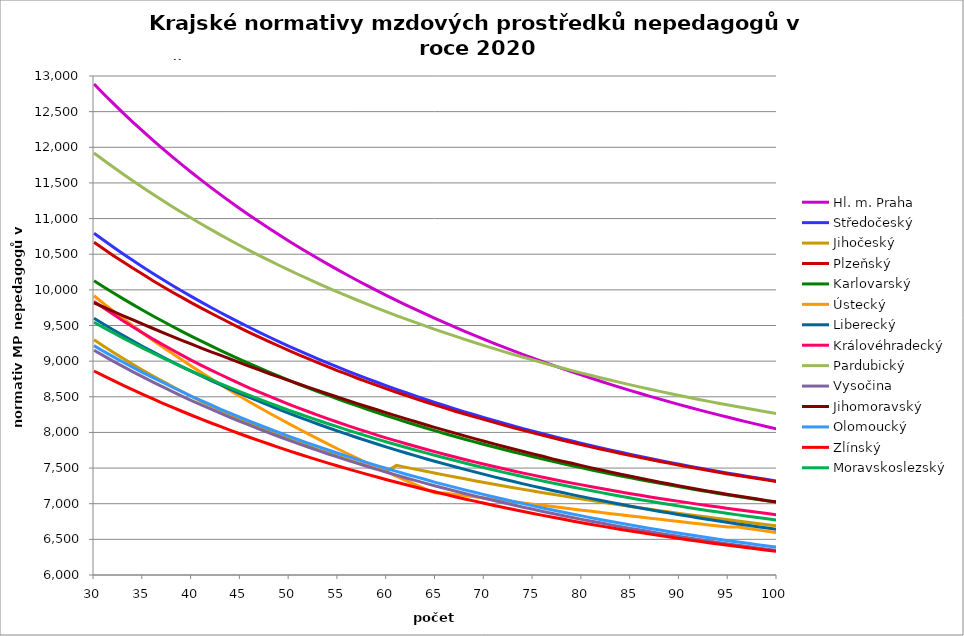
| Category | Hl. m. Praha | Středočeský | Jihočeský | Plzeňský | Karlovarský  | Ústecký   | Liberecký | Královéhradecký | Pardubický | Vysočina | Jihomoravský | Olomoucký | Zlínský | Moravskoslezský |
|---|---|---|---|---|---|---|---|---|---|---|---|---|---|---|
| 30.0 | 12887.899 | 10794.617 | 9300.023 | 10666.408 | 10127.339 | 9916.766 | 9600.68 | 9838.432 | 11920.836 | 9151.884 | 9818.262 | 9217.837 | 8861.837 | 9545.303 |
| 31.0 | 12747.959 | 10695.102 | 9209.316 | 10572.088 | 10040.577 | 9807.918 | 9517.817 | 9744.804 | 11818.709 | 9073.621 | 9756.943 | 9136.354 | 8793.187 | 9469.297 |
| 32.0 | 12611.88 | 10598.164 | 9121.343 | 10479.421 | 9955.947 | 9701.435 | 9437 | 9652.941 | 11719.092 | 8996.979 | 9696.386 | 9059.606 | 8726.113 | 9395.074 |
| 33.0 | 12479.512 | 10503.714 | 9036 | 10392.29 | 9873.379 | 9597.238 | 9358.161 | 9562.794 | 11621.902 | 8922.195 | 9636.575 | 8984.136 | 8660.569 | 9322.577 |
| 34.0 | 12350.715 | 10411.665 | 8953.186 | 10302.735 | 9792.806 | 9495.256 | 9281.237 | 9477.823 | 11527.059 | 8849.492 | 9577.497 | 8913.115 | 8596.508 | 9251.755 |
| 35.0 | 12225.352 | 10321.936 | 8872.806 | 10218.506 | 9714.163 | 9395.419 | 9206.165 | 9394.349 | 11434.489 | 8778.521 | 9519.14 | 8840.057 | 8533.888 | 9182.557 |
| 36.0 | 12103.296 | 10234.448 | 8794.77 | 10131.909 | 9637.39 | 9297.659 | 9132.885 | 9312.332 | 11344.12 | 8709.227 | 9461.489 | 8771.287 | 8472.665 | 9114.933 |
| 37.0 | 11984.426 | 10149.128 | 8718.993 | 10050.439 | 9562.427 | 9201.912 | 9061.343 | 9235.065 | 11255.882 | 8641.288 | 9404.533 | 8703.579 | 8412.799 | 9048.837 |
| 38.0 | 11868.625 | 10065.903 | 8645.394 | 9970.268 | 9489.22 | 9111.435 | 8991.482 | 9159.07 | 11169.71 | 8575.197 | 9348.258 | 8636.908 | 8354.252 | 8984.225 |
| 39.0 | 11755.783 | 9984.705 | 8573.895 | 9894.926 | 9417.713 | 9019.466 | 8923.253 | 9084.315 | 11085.54 | 8510.372 | 9292.652 | 8571.251 | 8296.985 | 8921.054 |
| 40.0 | 11645.796 | 9905.471 | 8504.423 | 9817.208 | 9347.856 | 8929.336 | 8856.604 | 9010.771 | 11003.311 | 8447.291 | 9237.704 | 8506.584 | 8240.964 | 8859.282 |
| 41.0 | 11538.564 | 9828.137 | 8436.909 | 9744.153 | 9279.599 | 8840.989 | 8791.489 | 8941.53 | 10922.967 | 8385.901 | 9183.402 | 8445.761 | 8186.153 | 8798.869 |
| 42.0 | 11433.991 | 9752.644 | 8371.286 | 9672.177 | 9212.895 | 8754.374 | 8727.861 | 8873.345 | 10844.45 | 8325.397 | 9129.735 | 8385.801 | 8132.52 | 8739.778 |
| 43.0 | 11331.987 | 9678.936 | 8307.491 | 9601.257 | 9147.699 | 8669.439 | 8665.677 | 8809.222 | 10767.707 | 8266.5 | 9079.795 | 8323.893 | 8080.032 | 8681.972 |
| 44.0 | 11232.465 | 9606.957 | 8245.465 | 9531.369 | 9083.966 | 8586.136 | 8604.896 | 8743.033 | 10692.688 | 8208.916 | 9027.328 | 8268.4 | 8028.66 | 8625.416 |
| 45.0 | 11135.343 | 9536.656 | 8185.149 | 9462.491 | 9021.656 | 8504.419 | 8545.476 | 8680.773 | 10619.343 | 8152.61 | 8975.465 | 8210.924 | 7978.372 | 8570.076 |
| 46.0 | 11040.541 | 9467.982 | 8126.489 | 9397.813 | 8960.727 | 8424.242 | 8487.38 | 8619.394 | 10547.624 | 8097.781 | 8924.194 | 8154.241 | 7929.142 | 8515.919 |
| 47.0 | 10947.984 | 9400.887 | 8069.433 | 9334.012 | 8901.142 | 8345.564 | 8430.569 | 8561.739 | 10477.487 | 8043.684 | 8873.505 | 8100.98 | 7880.941 | 8462.915 |
| 48.0 | 10857.6 | 9335.326 | 8013.932 | 9271.072 | 8842.863 | 8268.341 | 8375.009 | 8504.85 | 10408.887 | 7990.997 | 8823.389 | 8048.41 | 7833.743 | 8411.032 |
| 49.0 | 10769.32 | 9271.254 | 7959.937 | 9208.975 | 8785.855 | 8195.218 | 8320.664 | 8448.713 | 10341.782 | 7939.451 | 8776.735 | 7996.518 | 7787.522 | 8360.242 |
| 50.0 | 10683.077 | 9208.629 | 7907.404 | 9147.705 | 8730.082 | 8120.74 | 8267.503 | 8393.311 | 10276.133 | 7889.24 | 8727.703 | 7945.291 | 7742.255 | 8310.517 |
| 51.0 | 10598.808 | 9147.41 | 7856.288 | 9087.244 | 8675.513 | 8047.604 | 8215.492 | 8341.349 | 10211.9 | 7839.882 | 8679.216 | 7894.717 | 7697.917 | 8261.83 |
| 52.0 | 10516.453 | 9087.558 | 7806.549 | 9030.542 | 8622.115 | 7975.773 | 8164.602 | 8290.026 | 10149.045 | 7791.576 | 8631.264 | 7847.264 | 7654.485 | 8214.154 |
| 53.0 | 10435.954 | 9029.035 | 7758.147 | 8974.543 | 8569.858 | 7905.213 | 8114.803 | 8239.331 | 10087.534 | 7744.295 | 8586.615 | 7800.377 | 7611.938 | 8167.465 |
| 54.0 | 10357.254 | 8971.805 | 7711.044 | 8919.235 | 8518.712 | 7835.891 | 8066.067 | 8189.251 | 10027.33 | 7698.013 | 8539.678 | 7754.048 | 7570.253 | 8121.738 |
| 55.0 | 10280.3 | 8915.834 | 7665.203 | 8864.603 | 8468.649 | 7767.774 | 8018.366 | 8142.366 | 9968.401 | 7652.914 | 8493.252 | 7708.266 | 7529.412 | 8076.95 |
| 56.0 | 10205.041 | 8861.087 | 7620.59 | 8813.462 | 8419.641 | 7700.831 | 7971.674 | 8096.015 | 9910.714 | 7608.759 | 8450.016 | 7663.021 | 7489.393 | 8033.079 |
| 57.0 | 10131.428 | 8807.533 | 7577.172 | 8760.115 | 8371.662 | 7635.032 | 7925.966 | 8050.189 | 9854.239 | 7565.317 | 8404.557 | 7618.305 | 7450.177 | 7990.102 |
| 58.0 | 10059.414 | 8755.14 | 7534.916 | 8710.168 | 8324.687 | 7570.348 | 7881.217 | 8007.382 | 9798.945 | 7522.777 | 8359.585 | 7576.42 | 7411.747 | 7947.999 |
| 59.0 | 9988.952 | 8703.879 | 7493.792 | 8660.787 | 8278.692 | 7506.751 | 7837.404 | 7962.551 | 9744.804 | 7481.117 | 8317.695 | 7534.994 | 7374.083 | 7906.749 |
| 60.0 | 9920 | 8653.722 | 7453.771 | 8611.964 | 8233.651 | 7446.429 | 7794.504 | 7920.668 | 9691.787 | 7440.516 | 8273.645 | 7494.018 | 7337.17 | 7866.333 |
| 61.0 | 9852.515 | 8604.639 | 7537.567 | 8563.687 | 8189.543 | 7384.888 | 7752.495 | 7881.65 | 9639.868 | 7400.748 | 8232.61 | 7453.486 | 7300.989 | 7826.732 |
| 62.0 | 9786.457 | 8556.606 | 7509.433 | 8518.587 | 8146.346 | 7324.356 | 7711.356 | 7840.613 | 9589.02 | 7361.599 | 8189.454 | 7413.389 | 7265.525 | 7787.927 |
| 63.0 | 9721.787 | 8509.595 | 7481.701 | 8471.349 | 8104.038 | 7264.808 | 7671.066 | 7802.377 | 9539.219 | 7323.443 | 8149.248 | 7375.914 | 7230.762 | 7749.9 |
| 64.0 | 9658.467 | 8463.582 | 7454.365 | 8427.214 | 8062.598 | 7206.221 | 7631.606 | 7764.513 | 9490.441 | 7285.872 | 8106.96 | 7338.817 | 7196.686 | 7712.636 |
| 65.0 | 9596.462 | 8418.543 | 7427.419 | 8383.537 | 8022.007 | 7148.571 | 7592.956 | 7727.015 | 9442.662 | 7249.254 | 8067.558 | 7299.941 | 7163.28 | 7676.116 |
| 66.0 | 9535.737 | 8374.455 | 7400.856 | 8340.309 | 7982.246 | 7148.571 | 7555.098 | 7689.877 | 9395.859 | 7213.378 | 8028.537 | 7263.602 | 7130.532 | 7640.324 |
| 67.0 | 9476.258 | 8331.295 | 7374.671 | 8297.526 | 7943.296 | 7130.237 | 7518.015 | 7655.383 | 9350.011 | 7178.227 | 7989.892 | 7229.729 | 7098.427 | 7605.246 |
| 68.0 | 9417.994 | 8289.043 | 7348.857 | 8257.658 | 7905.138 | 7114.018 | 7481.689 | 7621.197 | 9305.096 | 7143.602 | 7951.617 | 7194.084 | 7066.952 | 7570.867 |
| 69.0 | 9360.913 | 8247.677 | 7323.409 | 8218.171 | 7867.757 | 7095.859 | 7446.103 | 7587.315 | 9261.094 | 7109.856 | 7913.707 | 7160.855 | 7036.094 | 7537.171 |
| 70.0 | 9304.985 | 8207.177 | 7298.32 | 8179.06 | 7831.134 | 7079.796 | 7411.242 | 7553.733 | 9217.986 | 7076.789 | 7876.157 | 7127.931 | 7005.841 | 7504.145 |
| 71.0 | 9250.181 | 8167.524 | 7273.586 | 8140.32 | 7795.254 | 7061.812 | 7377.089 | 7522.656 | 9175.752 | 7044.387 | 7838.961 | 7095.309 | 6976.181 | 7471.775 |
| 72.0 | 9196.474 | 8128.699 | 7249.201 | 8101.945 | 7760.101 | 7043.919 | 7343.63 | 7489.643 | 9134.373 | 7012.636 | 7802.115 | 7062.984 | 6947.101 | 7440.047 |
| 73.0 | 9143.836 | 8090.683 | 7225.159 | 8063.93 | 7725.659 | 7028.09 | 7310.851 | 7459.091 | 9093.832 | 6981.345 | 7767.885 | 7030.952 | 6918.591 | 7408.95 |
| 74.0 | 9092.242 | 8053.46 | 7201.455 | 8028.613 | 7691.915 | 7010.367 | 7278.736 | 7428.787 | 9054.112 | 6950.856 | 7731.703 | 7001.185 | 6890.639 | 7378.47 |
| 75.0 | 9041.667 | 8017.013 | 7178.084 | 7993.605 | 7658.853 | 6992.733 | 7247.273 | 7400.867 | 9015.195 | 6921.151 | 7698.087 | 6969.711 | 6863.235 | 7348.595 |
| 76.0 | 8992.085 | 7981.325 | 7155.042 | 7958.9 | 7626.461 | 6977.133 | 7216.448 | 7371.034 | 8977.066 | 6891.87 | 7664.762 | 6940.459 | 6836.368 | 7319.315 |
| 77.0 | 8943.475 | 7946.379 | 7132.323 | 7924.496 | 7594.724 | 6959.666 | 7186.248 | 7343.546 | 8939.709 | 6863.176 | 7629.532 | 6911.452 | 6810.029 | 7290.617 |
| 78.0 | 8895.812 | 7912.162 | 7109.922 | 7890.387 | 7563.63 | 6944.213 | 7156.661 | 7316.262 | 8903.108 | 6835.057 | 7596.796 | 6882.686 | 6784.207 | 7262.491 |
| 79.0 | 8849.076 | 7878.658 | 7087.836 | 7858.817 | 7533.166 | 6926.91 | 7127.675 | 7289.18 | 8867.249 | 6807.502 | 7566.496 | 6856.053 | 6758.893 | 7234.926 |
| 80.0 | 8803.245 | 7845.852 | 7066.059 | 7825.27 | 7503.32 | 6909.693 | 7099.279 | 7264.359 | 8832.118 | 6780.501 | 7534.298 | 6829.626 | 6734.079 | 7207.912 |
| 81.0 | 8758.299 | 7813.732 | 7044.587 | 7794.218 | 7474.08 | 6894.461 | 7071.46 | 7237.659 | 8797.7 | 6754.207 | 7502.373 | 6801.536 | 6709.754 | 7181.438 |
| 82.0 | 8714.218 | 7782.282 | 7023.416 | 7763.411 | 7445.436 | 6877.405 | 7044.209 | 7213.187 | 8763.983 | 6728.28 | 7472.819 | 6775.526 | 6685.911 | 7155.496 |
| 83.0 | 8670.982 | 7751.491 | 7002.541 | 7735.021 | 7417.375 | 6860.433 | 7017.514 | 7188.88 | 8730.953 | 6702.875 | 7443.498 | 6749.714 | 6662.54 | 7130.076 |
| 84.0 | 8628.574 | 7721.346 | 6981.958 | 7704.679 | 7389.887 | 6845.417 | 6991.366 | 7164.736 | 8698.597 | 6677.984 | 7412.336 | 6725.922 | 6639.635 | 7105.167 |
| 85.0 | 8586.974 | 7691.834 | 6961.664 | 7676.717 | 7362.963 | 6828.603 | 6965.754 | 7140.753 | 8666.904 | 6653.757 | 7385.539 | 6700.486 | 6617.187 | 7080.763 |
| 86.0 | 8546.167 | 7662.944 | 6941.653 | 7646.83 | 7336.59 | 6813.725 | 6940.669 | 7118.91 | 8635.861 | 6630.022 | 7356.898 | 6677.039 | 6595.188 | 7056.854 |
| 87.0 | 8506.135 | 7634.664 | 6921.923 | 7619.285 | 7310.761 | 6797.066 | 6916.101 | 7095.233 | 8605.458 | 6606.613 | 7328.477 | 6653.755 | 6573.631 | 7033.432 |
| 88.0 | 8466.861 | 7606.983 | 6902.47 | 7591.938 | 7285.466 | 6780.488 | 6892.042 | 7073.667 | 8575.683 | 6583.682 | 7302.282 | 6630.634 | 6552.509 | 7010.489 |
| 89.0 | 8428.33 | 7579.891 | 6883.29 | 7566.868 | 7260.694 | 6765.819 | 6868.482 | 7052.231 | 8546.524 | 6561.221 | 7276.274 | 6607.672 | 6531.814 | 6988.016 |
| 90.0 | 8390.527 | 7553.377 | 6864.379 | 7539.896 | 7236.438 | 6749.393 | 6845.413 | 7032.857 | 8517.973 | 6539.375 | 7250.45 | 6586.617 | 6511.54 | 6966.007 |
| 91.0 | 8353.436 | 7527.43 | 6845.733 | 7515.168 | 7212.689 | 6733.046 | 6822.827 | 7011.668 | 8490.018 | 6517.982 | 7224.81 | 6563.959 | 6491.681 | 6944.454 |
| 92.0 | 8317.044 | 7502.042 | 6827.35 | 7490.602 | 7189.439 | 6718.582 | 6800.716 | 6990.606 | 8462.65 | 6496.88 | 7199.349 | 6543.181 | 6472.229 | 6923.349 |
| 93.0 | 8281.336 | 7477.202 | 6809.225 | 7466.196 | 7166.678 | 6702.384 | 6779.072 | 6971.569 | 8435.858 | 6476.369 | 7176.006 | 6522.535 | 6453.179 | 6902.687 |
| 94.0 | 8246.3 | 7452.902 | 6791.356 | 7441.949 | 7144.4 | 6688.051 | 6757.887 | 6952.634 | 8409.635 | 6456.137 | 7152.814 | 6502.018 | 6434.524 | 6882.459 |
| 95.0 | 8211.921 | 7429.133 | 6773.739 | 7417.858 | 7122.597 | 6672 | 6737.155 | 6933.803 | 8383.971 | 6436.48 | 7129.772 | 6481.631 | 6416.26 | 6862.66 |
| 96.0 | 8178.186 | 7405.885 | 6756.371 | 7395.912 | 7101.261 | 6672 | 6716.867 | 6915.073 | 8358.856 | 6417.24 | 7106.877 | 6463.054 | 6398.379 | 6843.284 |
| 97.0 | 8145.085 | 7383.151 | 6739.249 | 7374.095 | 7080.385 | 6652.486 | 6697.018 | 6896.444 | 8334.284 | 6398.41 | 7086.019 | 6444.583 | 6380.876 | 6824.323 |
| 98.0 | 8112.604 | 7360.922 | 6722.37 | 7352.406 | 7059.963 | 6633.086 | 6677.6 | 6879.764 | 8310.245 | 6379.838 | 7065.283 | 6424.553 | 6363.746 | 6805.772 |
| 99.0 | 8080.733 | 7339.191 | 6705.73 | 7330.845 | 7039.987 | 6612.051 | 6658.607 | 6861.324 | 8286.731 | 6361.811 | 7042.8 | 6406.302 | 6346.985 | 6787.625 |
| 100.0 | 8049.459 | 7317.95 | 6689.328 | 7309.41 | 7020.45 | 6592.885 | 6640.033 | 6844.813 | 8263.735 | 6344.177 | 7024.173 | 6389.799 | 6330.586 | 6769.877 |